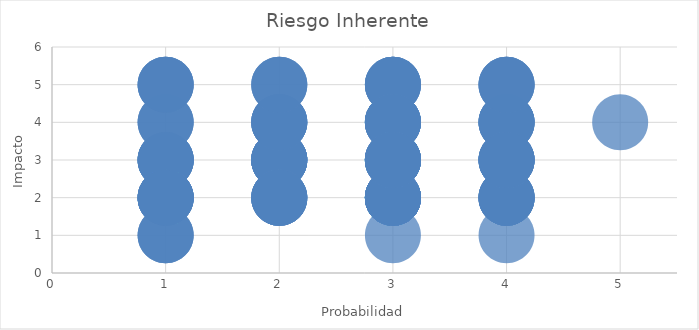
| Category | Series 0 |
|---|---|
| 2.0 | 4 |
| 3.0 | 3 |
| 3.0 | 5 |
| 3.0 | 4 |
| 1.0 | 5 |
| 4.0 | 4 |
| 3.0 | 5 |
| 3.0 | 5 |
| 3.0 | 2 |
| 3.0 | 3 |
| 2.0 | 3 |
| 1.0 | 3 |
| 3.0 | 3 |
| 1.0 | 2 |
| 1.0 | 3 |
| 1.0 | 4 |
| 2.0 | 3 |
| 1.0 | 4 |
| 3.0 | 4 |
| 3.0 | 4 |
| 3.0 | 3 |
| 1.0 | 5 |
| 1.0 | 4 |
| 1.0 | 3 |
| 2.0 | 3 |
| 2.0 | 3 |
| 1.0 | 3 |
| 3.0 | 3 |
| 3.0 | 3 |
| 3.0 | 3 |
| 3.0 | 2 |
| 3.0 | 3 |
| 2.0 | 3 |
| 2.0 | 4 |
| 2.0 | 2 |
| 2.0 | 3 |
| 3.0 | 2 |
| 2.0 | 2 |
| 2.0 | 2 |
| 1.0 | 2 |
| 1.0 | 2 |
| 3.0 | 4 |
| 3.0 | 4 |
| 2.0 | 2 |
| 3.0 | 1 |
| 4.0 | 2 |
| 3.0 | 3 |
| 1.0 | 1 |
| 2.0 | 2 |
| 3.0 | 2 |
| 4.0 | 1 |
| 3.0 | 5 |
| 3.0 | 3 |
| 2.0 | 3 |
| 3.0 | 2 |
| 2.0 | 3 |
| 2.0 | 4 |
| 2.0 | 4 |
| 3.0 | 4 |
| 4.0 | 4 |
| 4.0 | 3 |
| 4.0 | 3 |
| 3.0 | 3 |
| 3.0 | 2 |
| 3.0 | 3 |
| 2.0 | 3 |
| 1.0 | 5 |
| 3.0 | 2 |
| 3.0 | 4 |
| 3.0 | 4 |
| 3.0 | 2 |
| 3.0 | 2 |
| 2.0 | 3 |
| 2.0 | 4 |
| 3.0 | 2 |
| 3.0 | 2 |
| 3.0 | 2 |
| 3.0 | 2 |
| 3.0 | 5 |
| 1.0 | 2 |
| 3.0 | 3 |
| 3.0 | 3 |
| 1.0 | 5 |
| 4.0 | 2 |
| 2.0 | 3 |
| 2.0 | 5 |
| 2.0 | 5 |
| 4.0 | 4 |
| 1.0 | 3 |
| 1.0 | 1 |
| 3.0 | 2 |
| 3.0 | 4 |
| 4.0 | 3 |
| 4.0 | 3 |
| 3.0 | 2 |
| 4.0 | 2 |
| 1.0 | 1 |
| 3.0 | 4 |
| 3.0 | 2 |
| 1.0 | 2 |
| 2.0 | 2 |
| 2.0 | 2 |
| 2.0 | 4 |
| 4.0 | 3 |
| 4.0 | 4 |
| 4.0 | 3 |
| 3.0 | 2 |
| 4.0 | 4 |
| 4.0 | 4 |
| 5.0 | 4 |
| 4.0 | 5 |
| 4.0 | 5 |
| 4.0 | 5 |
| 3.0 | 3 |
| 4.0 | 2 |
| 4.0 | 5 |
| 4.0 | 2 |
| 4.0 | 2 |
| 3.0 | 2 |
| 3.0 | 2 |
| 4.0 | 2 |
| 4.0 | 2 |
| 3.0 | 2 |
| 3.0 | 2 |
| 4.0 | 3 |
| 3.0 | 2 |
| 3.0 | 3 |
| 4.0 | 3 |
| 3.0 | 3 |
| 2.0 | 5 |
| 1.0 | 3 |
| 1.0 | 3 |
| 1.0 | 3 |
| 1.0 | 2 |
| 1.0 | 2 |
| 1.0 | 2 |
| 1.0 | 2 |
| 1.0 | 2 |